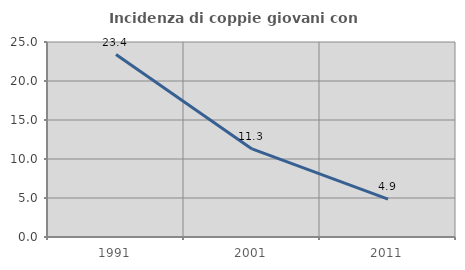
| Category | Incidenza di coppie giovani con figli |
|---|---|
| 1991.0 | 23.392 |
| 2001.0 | 11.29 |
| 2011.0 | 4.865 |